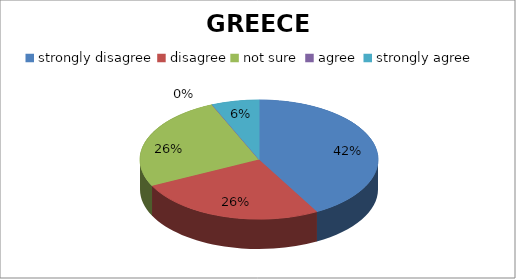
| Category | GREECE |
|---|---|
| strongly disagree | 26 |
| disagree | 16 |
| not sure  | 16 |
| agree  | 0 |
| strongly agree | 4 |